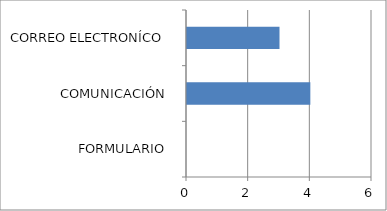
| Category | Series 0 |
|---|---|
| FORMULARIO  | 0 |
| COMUNICACIÓN  | 4 |
| CORREO ELECTRONÍCO  | 3 |